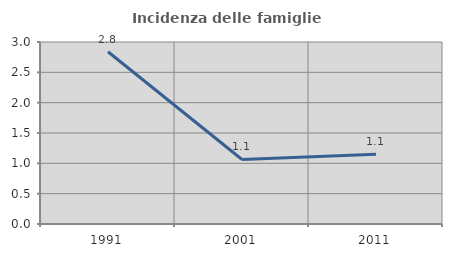
| Category | Incidenza delle famiglie numerose |
|---|---|
| 1991.0 | 2.839 |
| 2001.0 | 1.064 |
| 2011.0 | 1.149 |